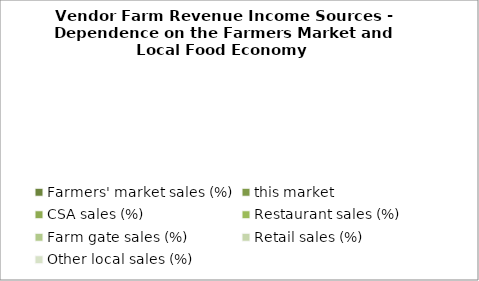
| Category | Farmers' market sales (%) | this market | CSA sales (%) | Restaurant sales (%) | Farm gate sales (%) | Retail sales (%) | Other local sales (%) |
|---|---|---|---|---|---|---|---|
| 0 | 0 | 0 | 0 | 0 | 0 | 0 | 0 |